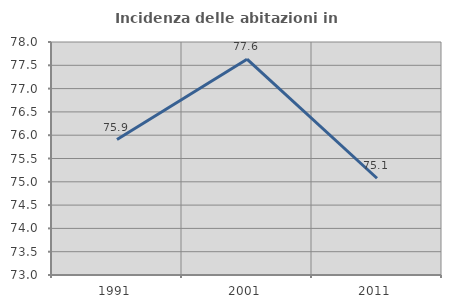
| Category | Incidenza delle abitazioni in proprietà  |
|---|---|
| 1991.0 | 75.908 |
| 2001.0 | 77.632 |
| 2011.0 | 75.076 |